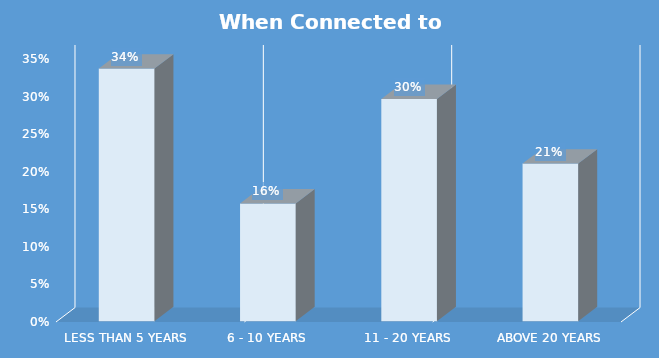
| Category | When Connected to Grid |
|---|---|
| Less than 5 years | 0.337 |
| 6 - 10 years | 0.157 |
| 11 - 20 years | 0.296 |
| Above 20 years | 0.21 |